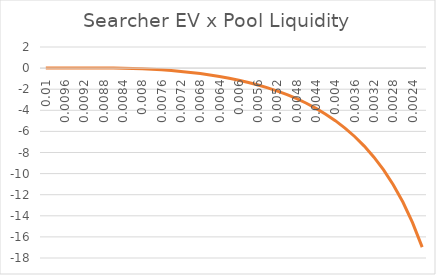
| Category | (dRate/dVlm) |
|---|---|
| 0.01 | 0 |
| 0.0098 | 0 |
| 0.0096 | 0 |
| 0.009399999999999999 | 0 |
| 0.009199999999999998 | 0.008 |
| 0.008999999999999998 | 0.016 |
| 0.008799999999999997 | 0.016 |
| 0.008599999999999997 | 0.009 |
| 0.008399999999999996 | -0.007 |
| 0.008199999999999995 | -0.032 |
| 0.007999999999999995 | -0.066 |
| 0.007799999999999995 | -0.111 |
| 0.007599999999999996 | -0.167 |
| 0.007399999999999996 | -0.235 |
| 0.007199999999999996 | -0.316 |
| 0.006999999999999997 | -0.411 |
| 0.006799999999999997 | -0.521 |
| 0.006599999999999997 | -0.649 |
| 0.006399999999999998 | -0.795 |
| 0.006199999999999998 | -0.961 |
| 0.005999999999999998 | -1.149 |
| 0.005799999999999999 | -1.362 |
| 0.005599999999999999 | -1.602 |
| 0.005399999999999999 | -1.872 |
| 0.0052 | -2.175 |
| 0.005 | -2.516 |
| 0.0048000000000000004 | -2.9 |
| 0.004600000000000001 | -3.331 |
| 0.004400000000000001 | -3.817 |
| 0.0042000000000000015 | -4.364 |
| 0.004000000000000002 | -4.983 |
| 0.0038000000000000017 | -5.685 |
| 0.0036000000000000016 | -6.483 |
| 0.0034000000000000015 | -7.394 |
| 0.0032000000000000015 | -8.44 |
| 0.0030000000000000014 | -9.647 |
| 0.0028000000000000013 | -11.051 |
| 0.002600000000000001 | -12.696 |
| 0.002400000000000001 | -14.642 |
| 0.002200000000000001 | -16.973 |